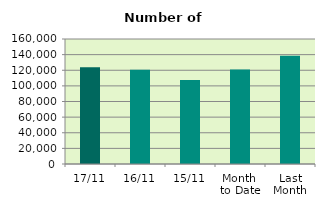
| Category | Series 0 |
|---|---|
| 17/11 | 123876 |
| 16/11 | 120494 |
| 15/11 | 107592 |
| Month 
to Date | 121054 |
| Last
Month | 138693.238 |